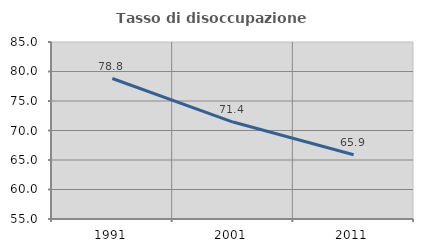
| Category | Tasso di disoccupazione giovanile  |
|---|---|
| 1991.0 | 78.812 |
| 2001.0 | 71.429 |
| 2011.0 | 65.886 |